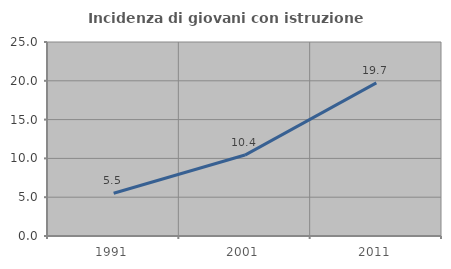
| Category | Incidenza di giovani con istruzione universitaria |
|---|---|
| 1991.0 | 5.508 |
| 2001.0 | 10.43 |
| 2011.0 | 19.726 |